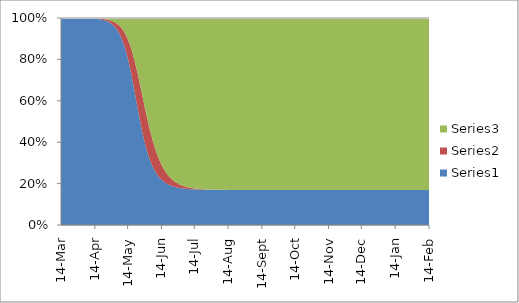
| Category | Series 0 | Series 1 | Series 2 |
|---|---|---|---|
| 2020-03-14 | 5600000 | 100 | 0 |
| 2020-03-15 | 5599970 | 115.714 | 14.286 |
| 2020-03-16 | 5599935.286 | 133.898 | 30.816 |
| 2020-03-17 | 5599895.117 | 154.938 | 49.945 |
| 2020-03-18 | 5599848.636 | 179.285 | 72.079 |
| 2020-03-19 | 5599794.852 | 207.457 | 97.691 |
| 2020-03-20 | 5599732.618 | 240.055 | 127.327 |
| 2020-03-21 | 5599660.605 | 277.774 | 161.621 |
| 2020-03-22 | 5599577.277 | 321.42 | 201.303 |
| 2020-03-23 | 5599480.859 | 371.921 | 247.22 |
| 2020-03-24 | 5599369.293 | 430.356 | 300.352 |
| 2020-03-25 | 5599240.2 | 497.968 | 361.831 |
| 2020-03-26 | 5599090.83 | 576.2 | 432.97 |
| 2020-03-27 | 5598917.998 | 666.718 | 515.284 |
| 2020-03-28 | 5598718.021 | 771.449 | 610.529 |
| 2020-03-29 | 5598486.64 | 892.624 | 720.736 |
| 2020-03-30 | 5598218.925 | 1032.821 | 848.254 |
| 2020-03-31 | 5597909.177 | 1195.023 | 995.8 |
| 2020-04-01 | 5597550.804 | 1382.679 | 1166.518 |
| 2020-04-02 | 5597136.182 | 1599.775 | 1364.043 |
| 2020-04-03 | 5596656.495 | 1850.923 | 1592.582 |
| 2020-04-04 | 5596101.549 | 2141.451 | 1857 |
| 2020-04-05 | 5595459.561 | 2477.517 | 2162.921 |
| 2020-04-06 | 5594716.909 | 2866.239 | 2516.853 |
| 2020-04-07 | 5593857.848 | 3315.837 | 2926.315 |
| 2020-04-08 | 5592864.188 | 3835.806 | 3400.006 |
| 2020-04-09 | 5591714.913 | 4437.109 | 3947.978 |
| 2020-04-10 | 5590385.749 | 5132.399 | 4581.851 |
| 2020-04-11 | 5588848.673 | 5936.276 | 5315.051 |
| 2020-04-12 | 5587071.337 | 6865.573 | 6163.09 |
| 2020-04-13 | 5585016.42 | 7939.694 | 7143.887 |
| 2020-04-14 | 5582640.885 | 9180.987 | 8278.129 |
| 2020-04-15 | 5579895.127 | 10615.175 | 9589.698 |
| 2020-04-16 | 5576722.007 | 12271.841 | 11106.152 |
| 2020-04-17 | 5573055.759 | 14184.97 | 12859.272 |
| 2020-04-18 | 5568820.743 | 16393.561 | 14885.696 |
| 2020-04-19 | 5563930.057 | 18942.31 | 17227.633 |
| 2020-04-20 | 5558283.967 | 21882.356 | 19933.678 |
| 2020-04-21 | 5551768.162 | 25272.109 | 23059.728 |
| 2020-04-22 | 5544251.829 | 29178.142 | 26670.03 |
| 2020-04-23 | 5535585.527 | 33676.137 | 30838.336 |
| 2020-04-24 | 5525598.894 | 38851.893 | 35649.212 |
| 2020-04-25 | 5514098.181 | 44802.336 | 41199.483 |
| 2020-04-26 | 5500863.656 | 51636.528 | 47599.817 |
| 2020-04-27 | 5485646.933 | 59476.604 | 54976.463 |
| 2020-04-28 | 5468168.309 | 68458.57 | 63473.121 |
| 2020-04-29 | 5448114.22 | 78732.863 | 73252.917 |
| 2020-04-30 | 5425134.99 | 90464.541 | 84500.469 |
| 2020-05-01 | 5398843.078 | 103832.947 | 97423.975 |
| 2020-05-02 | 5368812.126 | 119030.622 | 112257.253 |
| 2020-05-03 | 5334577.141 | 136261.232 | 129261.627 |
| 2020-05-04 | 5295636.281 | 155736.201 | 148727.517 |
| 2020-05-05 | 5251454.731 | 177669.723 | 170975.546 |
| 2020-05-06 | 5201471.275 | 202271.79 | 196356.935 |
| 2020-05-07 | 5145108.19 | 229738.904 | 225252.905 |
| 2020-05-08 | 5081785.073 | 260242.178 | 258072.749 |
| 2020-05-09 | 5010937.137 | 293912.66 | 295250.203 |
| 2020-05-10 | 4932038.323 | 330823.952 | 337237.726 |
| 2020-05-11 | 4844629.229 | 370972.48 | 384498.29 |
| 2020-05-12 | 4748349.366 | 414256.275 | 437494.359 |
| 2020-05-13 | 4642972.57 | 460453.603 | 496673.827 |
| 2020-05-14 | 4528443.635 | 509203.452 | 562452.913 |
| 2020-05-15 | 4404913.325 | 559990.412 | 635196.263 |
| 2020-05-16 | 4272768.187 | 612136.919 | 715194.893 |
| 2020-05-17 | 4132651.09 | 664805.885 | 802643.025 |
| 2020-05-18 | 3985468.37 | 717016.336 | 897615.294 |
| 2020-05-19 | 3832380.195 | 767673.605 | 1000046.199 |
| 2020-05-20 | 3674772.135 | 815614.008 | 1109713.857 |
| 2020-05-21 | 3514208.084 | 859661.772 | 1226230.144 |
| 2020-05-22 | 3352367.172 | 898693.859 | 1349038.969 |
| 2020-05-23 | 3190969.755 | 931706.44 | 1477423.806 |
| 2020-05-24 | 3031699.376 | 957875.898 | 1610524.726 |
| 2020-05-25 | 2876128.389 | 976607.472 | 1747364.14 |
| 2020-05-26 | 2725654.363 | 987566.144 | 1886879.493 |
| 2020-05-27 | 2581452.722 | 990686.907 | 2027960.37 |
| 2020-05-28 | 2444448.539 | 986164.389 | 2169487.071 |
| 2020-05-29 | 2315307.748 | 974424.553 | 2310367.698 |
| 2020-05-30 | 2194445.638 | 956083.156 | 2449571.206 |
| 2020-05-31 | 2082048.897 | 931896.589 | 2586154.514 |
| 2020-06-01 | 1978106.704 | 902710.698 | 2719282.598 |
| 2020-06-02 | 1882446.449 | 869412.281 | 2848241.269 |
| 2020-06-03 | 1794770.268 | 832886.709 | 2972443.024 |
| 2020-06-04 | 1714689.537 | 793983.624 | 3091426.839 |
| 2020-06-05 | 1641755.497 | 753491.432 | 3204853.071 |
| 2020-06-06 | 1575485.031 | 712120.265 | 3312494.704 |
| 2020-06-07 | 1515381.38 | 670492.449 | 3414226.171 |
| 2020-06-08 | 1460950.035 | 629139.158 | 3510010.806 |
| 2020-06-09 | 1411710.345 | 588501.826 | 3599887.829 |
| 2020-06-10 | 1367203.518 | 548936.964 | 3683959.518 |
| 2020-06-11 | 1326997.703 | 510723.213 | 3762379.085 |
| 2020-06-12 | 1290690.817 | 474069.639 | 3835339.544 |
| 2020-06-13 | 1257911.675 | 439124.548 | 3903063.778 |
| 2020-06-14 | 1228319.894 | 405984.25 | 3965795.856 |
| 2020-06-15 | 1201604.973 | 374701.421 | 4023793.606 |
| 2020-06-16 | 1177484.808 | 345292.812 | 4077322.38 |
| 2020-06-17 | 1155703.895 | 317746.18 | 4126649.925 |
| 2020-06-18 | 1136031.368 | 292026.396 | 4172042.236 |
| 2020-06-19 | 1118258.985 | 268080.722 | 4213760.293 |
| 2020-06-20 | 1102199.145 | 245843.316 | 4252057.539 |
| 2020-06-21 | 1087682.987 | 225239.001 | 4287178.013 |
| 2020-06-22 | 1074558.596 | 206186.391 | 4319355.013 |
| 2020-06-23 | 1062689.345 | 188600.444 | 4348810.211 |
| 2020-06-24 | 1051952.362 | 172394.506 | 4375753.132 |
| 2020-06-25 | 1042237.14 | 157481.942 | 4400380.919 |
| 2020-06-26 | 1033444.272 | 143777.389 | 4422878.339 |
| 2020-06-27 | 1025484.312 | 131197.722 | 4443417.966 |
| 2020-06-28 | 1018276.748 | 119662.755 | 4462160.497 |
| 2020-06-29 | 1011749.08 | 109095.743 | 4479255.177 |
| 2020-06-30 | 1005835.998 | 99423.719 | 4494840.283 |
| 2020-07-01 | 1000478.644 | 90577.685 | 4509043.671 |
| 2020-07-02 | 995623.945 | 82492.714 | 4521983.341 |
| 2020-07-03 | 991224.032 | 75107.954 | 4533768.014 |
| 2020-07-04 | 987235.702 | 68366.576 | 4544497.722 |
| 2020-07-05 | 983619.957 | 62215.668 | 4554264.375 |
| 2020-07-06 | 980341.569 | 56606.103 | 4563152.328 |
| 2020-07-07 | 977368.712 | 51492.373 | 4571238.914 |
| 2020-07-08 | 974672.621 | 46832.411 | 4578594.968 |
| 2020-07-09 | 972227.286 | 42587.402 | 4585285.312 |
| 2020-07-10 | 970009.18 | 38721.593 | 4591369.227 |
| 2020-07-11 | 967997.021 | 35202.096 | 4596900.883 |
| 2020-07-12 | 966171.547 | 31998.7 | 4601929.754 |
| 2020-07-13 | 964515.32 | 29083.684 | 4606500.997 |
| 2020-07-14 | 963012.552 | 26431.639 | 4610655.808 |
| 2020-07-15 | 961648.945 | 24019.298 | 4614431.757 |
| 2020-07-16 | 960411.545 | 21825.37 | 4617863.085 |
| 2020-07-17 | 959288.617 | 19830.388 | 4620980.995 |
| 2020-07-18 | 958269.524 | 18016.569 | 4623813.908 |
| 2020-07-19 | 957344.628 | 16367.669 | 4626387.703 |
| 2020-07-20 | 956505.19 | 14868.868 | 4628725.942 |
| 2020-07-21 | 955743.289 | 13506.645 | 4630850.066 |
| 2020-07-22 | 955051.742 | 12268.672 | 4632779.586 |
| 2020-07-23 | 954424.034 | 11143.712 | 4634532.254 |
| 2020-07-24 | 953854.257 | 10121.53 | 4636124.213 |
| 2020-07-25 | 953337.054 | 9192.801 | 4637570.146 |
| 2020-07-26 | 952867.563 | 8349.035 | 4638883.403 |
| 2020-07-27 | 952441.374 | 7582.504 | 4640076.122 |
| 2020-07-28 | 952054.487 | 6886.176 | 4641159.337 |
| 2020-07-29 | 951703.272 | 6253.652 | 4642143.076 |
| 2020-07-30 | 951384.435 | 5679.11 | 4643036.455 |
| 2020-07-31 | 951094.987 | 5157.256 | 4643847.757 |
| 2020-08-01 | 950832.217 | 4683.275 | 4644584.508 |
| 2020-08-02 | 950593.663 | 4252.79 | 4645253.547 |
| 2020-08-03 | 950377.092 | 3861.82 | 4645861.088 |
| 2020-08-04 | 950180.474 | 3506.749 | 4646412.777 |
| 2020-08-05 | 950001.972 | 3184.287 | 4646913.741 |
| 2020-08-06 | 949839.914 | 2891.447 | 4647368.639 |
| 2020-08-07 | 949692.785 | 2625.512 | 4647781.703 |
| 2020-08-08 | 949559.209 | 2384.015 | 4648156.776 |
| 2020-08-09 | 949437.935 | 2164.715 | 4648497.35 |
| 2020-08-10 | 949327.832 | 1965.573 | 4648806.595 |
| 2020-08-11 | 949227.869 | 1784.74 | 4649087.391 |
| 2020-08-12 | 949137.113 | 1620.534 | 4649342.354 |
| 2020-08-13 | 949054.714 | 1471.428 | 4649573.858 |
| 2020-08-14 | 948979.903 | 1336.034 | 4649784.062 |
| 2020-08-15 | 948911.982 | 1213.094 | 4649974.924 |
| 2020-08-16 | 948850.315 | 1101.462 | 4650148.224 |
| 2020-08-17 | 948794.326 | 1000.099 | 4650305.575 |
| 2020-08-18 | 948743.493 | 908.061 | 4650448.447 |
| 2020-08-19 | 948697.34 | 824.491 | 4650578.17 |
| 2020-08-20 | 948655.437 | 748.609 | 4650695.954 |
| 2020-08-21 | 948617.392 | 679.71 | 4650802.898 |
| 2020-08-22 | 948582.85 | 617.151 | 4650900 |
| 2020-08-23 | 948551.488 | 560.348 | 4650988.164 |
| 2020-08-24 | 948523.014 | 508.773 | 4651068.214 |
| 2020-08-25 | 948497.161 | 461.943 | 4651140.895 |
| 2020-08-26 | 948473.689 | 419.424 | 4651206.887 |
| 2020-08-27 | 948452.377 | 380.818 | 4651266.805 |
| 2020-08-28 | 948433.028 | 345.764 | 4651321.208 |
| 2020-08-29 | 948415.46 | 313.937 | 4651370.602 |
| 2020-08-30 | 948399.51 | 285.04 | 4651415.451 |
| 2020-08-31 | 948385.028 | 258.802 | 4651456.171 |
| 2020-09-01 | 948371.879 | 234.979 | 4651493.142 |
| 2020-09-02 | 948359.941 | 213.349 | 4651526.711 |
| 2020-09-03 | 948349.101 | 193.71 | 4651557.189 |
| 2020-09-04 | 948339.26 | 175.878 | 4651584.862 |
| 2020-09-05 | 948330.325 | 159.688 | 4651609.987 |
| 2020-09-06 | 948322.212 | 144.988 | 4651632.8 |
| 2020-09-07 | 948314.846 | 131.641 | 4651653.513 |
| 2020-09-08 | 948308.159 | 119.523 | 4651672.318 |
| 2020-09-09 | 948302.086 | 108.52 | 4651689.393 |
| 2020-09-10 | 948296.573 | 98.531 | 4651704.896 |
| 2020-09-11 | 948291.568 | 89.46 | 4651718.972 |
| 2020-09-12 | 948287.023 | 81.225 | 4651731.752 |
| 2020-09-13 | 948282.897 | 73.748 | 4651743.355 |
| 2020-09-14 | 948279.15 | 66.959 | 4651753.891 |
| 2020-09-15 | 948275.749 | 60.795 | 4651763.456 |
| 2020-09-16 | 948272.661 | 55.198 | 4651772.141 |
| 2020-09-17 | 948269.856 | 50.117 | 4651780.027 |
| 2020-09-18 | 948267.31 | 45.503 | 4651787.186 |
| 2020-09-19 | 948264.999 | 41.314 | 4651793.687 |
| 2020-09-20 | 948262.9 | 37.511 | 4651799.589 |
| 2020-09-21 | 948260.995 | 34.058 | 4651804.948 |
| 2020-09-22 | 948259.264 | 30.923 | 4651809.813 |
| 2020-09-23 | 948257.694 | 28.076 | 4651814.23 |
| 2020-09-24 | 948256.267 | 25.491 | 4651818.241 |
| 2020-09-25 | 948254.972 | 23.145 | 4651821.883 |
| 2020-09-26 | 948253.797 | 21.014 | 4651825.189 |
| 2020-09-27 | 948252.729 | 19.08 | 4651828.191 |
| 2020-09-28 | 948251.76 | 17.323 | 4651830.917 |
| 2020-09-29 | 948250.88 | 15.728 | 4651833.392 |
| 2020-09-30 | 948250.081 | 14.28 | 4651835.639 |
| 2020-10-01 | 948249.356 | 12.966 | 4651837.679 |
| 2020-10-02 | 948248.697 | 11.772 | 4651839.531 |
| 2020-10-03 | 948248.099 | 10.688 | 4651841.213 |
| 2020-10-04 | 948247.556 | 9.705 | 4651842.74 |
| 2020-10-05 | 948247.063 | 8.811 | 4651844.126 |
| 2020-10-06 | 948246.615 | 8 | 4651845.385 |
| 2020-10-07 | 948246.209 | 7.264 | 4651846.528 |
| 2020-10-08 | 948245.84 | 6.595 | 4651847.565 |
| 2020-10-09 | 948245.505 | 5.988 | 4651848.507 |
| 2020-10-10 | 948245.201 | 5.437 | 4651849.363 |
| 2020-10-11 | 948244.925 | 4.936 | 4651850.139 |
| 2020-10-12 | 948244.674 | 4.482 | 4651850.844 |
| 2020-10-13 | 948244.446 | 4.069 | 4651851.485 |
| 2020-10-14 | 948244.24 | 3.694 | 4651852.066 |
| 2020-10-15 | 948244.052 | 3.354 | 4651852.594 |
| 2020-10-16 | 948243.881 | 3.046 | 4651853.073 |
| 2020-10-17 | 948243.727 | 2.765 | 4651853.508 |
| 2020-10-18 | 948243.586 | 2.511 | 4651853.903 |
| 2020-10-19 | 948243.459 | 2.28 | 4651854.262 |
| 2020-10-20 | 948243.343 | 2.07 | 4651854.587 |
| 2020-10-21 | 948243.238 | 1.879 | 4651854.883 |
| 2020-10-22 | 948243.142 | 1.706 | 4651855.152 |
| 2020-10-23 | 948243.056 | 1.549 | 4651855.395 |
| 2020-10-24 | 948242.977 | 1.406 | 4651855.617 |
| 2020-10-25 | 948242.906 | 1.277 | 4651855.817 |
| 2020-10-26 | 948242.841 | 1.159 | 4651856 |
| 2020-10-27 | 948242.782 | 1.053 | 4651856.166 |
| 2020-10-28 | 948242.728 | 0.956 | 4651856.316 |
| 2020-10-29 | 948242.68 | 0.868 | 4651856.452 |
| 2020-10-30 | 948242.636 | 0.788 | 4651856.576 |
| 2020-10-31 | 948242.596 | 0.715 | 4651856.689 |
| 2020-11-01 | 948242.559 | 0.65 | 4651856.791 |
| 2020-11-02 | 948242.526 | 0.59 | 4651856.884 |
| 2020-11-03 | 948242.496 | 0.535 | 4651856.968 |
| 2020-11-04 | 948242.469 | 0.486 | 4651857.045 |
| 2020-11-05 | 948242.444 | 0.441 | 4651857.114 |
| 2020-11-06 | 948242.422 | 0.401 | 4651857.177 |
| 2020-11-07 | 948242.402 | 0.364 | 4651857.234 |
| 2020-11-08 | 948242.383 | 0.33 | 4651857.286 |
| 2020-11-09 | 948242.366 | 0.3 | 4651857.334 |
| 2020-11-10 | 948242.351 | 0.272 | 4651857.377 |
| 2020-11-11 | 948242.337 | 0.247 | 4651857.415 |
| 2020-11-12 | 948242.325 | 0.225 | 4651857.451 |
| 2020-11-13 | 948242.313 | 0.204 | 4651857.483 |
| 2020-11-14 | 948242.303 | 0.185 | 4651857.512 |
| 2020-11-15 | 948242.294 | 0.168 | 4651857.538 |
| 2020-11-16 | 948242.285 | 0.153 | 4651857.562 |
| 2020-11-17 | 948242.277 | 0.139 | 4651857.584 |
| 2020-11-18 | 948242.27 | 0.126 | 4651857.604 |
| 2020-11-19 | 948242.264 | 0.114 | 4651857.622 |
| 2020-11-20 | 948242.258 | 0.104 | 4651857.638 |
| 2020-11-21 | 948242.253 | 0.094 | 4651857.653 |
| 2020-11-22 | 948242.248 | 0.085 | 4651857.667 |
| 2020-11-23 | 948242.244 | 0.078 | 4651857.679 |
| 2020-11-24 | 948242.24 | 0.07 | 4651857.69 |
| 2020-11-25 | 948242.236 | 0.064 | 4651857.7 |
| 2020-11-26 | 948242.233 | 0.058 | 4651857.709 |
| 2020-11-27 | 948242.23 | 0.053 | 4651857.717 |
| 2020-11-28 | 948242.227 | 0.048 | 4651857.725 |
| 2020-11-29 | 948242.225 | 0.043 | 4651857.732 |
| 2020-11-30 | 948242.223 | 0.039 | 4651857.738 |
| 2020-12-01 | 948242.221 | 0.036 | 4651857.744 |
| 2020-12-02 | 948242.219 | 0.033 | 4651857.749 |
| 2020-12-03 | 948242.217 | 0.03 | 4651857.753 |
| 2020-12-04 | 948242.216 | 0.027 | 4651857.758 |
| 2020-12-05 | 948242.214 | 0.024 | 4651857.761 |
| 2020-12-06 | 948242.213 | 0.022 | 4651857.765 |
| 2020-12-07 | 948242.212 | 0.02 | 4651857.768 |
| 2020-12-08 | 948242.211 | 0.018 | 4651857.771 |
| 2020-12-09 | 948242.21 | 0.017 | 4651857.773 |
| 2020-12-10 | 948242.209 | 0.015 | 4651857.776 |
| 2020-12-11 | 948242.208 | 0.014 | 4651857.778 |
| 2020-12-12 | 948242.208 | 0.012 | 4651857.78 |
| 2020-12-13 | 948242.207 | 0.011 | 4651857.782 |
| 2020-12-14 | 948242.206 | 0.01 | 4651857.783 |
| 2020-12-15 | 948242.206 | 0.009 | 4651857.785 |
| 2020-12-16 | 948242.205 | 0.008 | 4651857.786 |
| 2020-12-17 | 948242.205 | 0.008 | 4651857.787 |
| 2020-12-18 | 948242.205 | 0.007 | 4651857.788 |
| 2020-12-19 | 948242.204 | 0.006 | 4651857.789 |
| 2020-12-20 | 948242.204 | 0.006 | 4651857.79 |
| 2020-12-21 | 948242.204 | 0.005 | 4651857.791 |
| 2020-12-22 | 948242.203 | 0.005 | 4651857.792 |
| 2020-12-23 | 948242.203 | 0.004 | 4651857.793 |
| 2020-12-24 | 948242.203 | 0.004 | 4651857.793 |
| 2020-12-25 | 948242.203 | 0.004 | 4651857.794 |
| 2020-12-26 | 948242.203 | 0.003 | 4651857.794 |
| 2020-12-27 | 948242.202 | 0.003 | 4651857.795 |
| 2020-12-28 | 948242.202 | 0.003 | 4651857.795 |
| 2020-12-29 | 948242.202 | 0.002 | 4651857.795 |
| 2020-12-30 | 948242.202 | 0.002 | 4651857.796 |
| 2020-12-31 | 948242.202 | 0.002 | 4651857.796 |
| 2021-01-01 | 948242.202 | 0.002 | 4651857.796 |
| 2021-01-02 | 948242.202 | 0.002 | 4651857.797 |
| 2021-01-03 | 948242.202 | 0.001 | 4651857.797 |
| 2021-01-04 | 948242.202 | 0.001 | 4651857.797 |
| 2021-01-05 | 948242.202 | 0.001 | 4651857.797 |
| 2021-01-06 | 948242.201 | 0.001 | 4651857.797 |
| 2021-01-07 | 948242.201 | 0.001 | 4651857.798 |
| 2021-01-08 | 948242.201 | 0.001 | 4651857.798 |
| 2021-01-09 | 948242.201 | 0.001 | 4651857.798 |
| 2021-01-10 | 948242.201 | 0.001 | 4651857.798 |
| 2021-01-11 | 948242.201 | 0.001 | 4651857.798 |
| 2021-01-12 | 948242.201 | 0.001 | 4651857.798 |
| 2021-01-13 | 948242.201 | 0.001 | 4651857.798 |
| 2021-01-14 | 948242.201 | 0.001 | 4651857.798 |
| 2021-01-15 | 948242.201 | 0 | 4651857.798 |
| 2021-01-16 | 948242.201 | 0 | 4651857.798 |
| 2021-01-17 | 948242.201 | 0 | 4651857.799 |
| 2021-01-18 | 948242.201 | 0 | 4651857.799 |
| 2021-01-19 | 948242.201 | 0 | 4651857.799 |
| 2021-01-20 | 948242.201 | 0 | 4651857.799 |
| 2021-01-21 | 948242.201 | 0 | 4651857.799 |
| 2021-01-22 | 948242.201 | 0 | 4651857.799 |
| 2021-01-23 | 948242.201 | 0 | 4651857.799 |
| 2021-01-24 | 948242.201 | 0 | 4651857.799 |
| 2021-01-25 | 948242.201 | 0 | 4651857.799 |
| 2021-01-26 | 948242.201 | 0 | 4651857.799 |
| 2021-01-27 | 948242.201 | 0 | 4651857.799 |
| 2021-01-28 | 948242.201 | 0 | 4651857.799 |
| 2021-01-29 | 948242.201 | 0 | 4651857.799 |
| 2021-01-30 | 948242.201 | 0 | 4651857.799 |
| 2021-01-31 | 948242.201 | 0 | 4651857.799 |
| 2021-02-01 | 948242.201 | 0 | 4651857.799 |
| 2021-02-02 | 948242.201 | 0 | 4651857.799 |
| 2021-02-03 | 948242.201 | 0 | 4651857.799 |
| 2021-02-04 | 948242.201 | 0 | 4651857.799 |
| 2021-02-05 | 948242.201 | 0 | 4651857.799 |
| 2021-02-06 | 948242.201 | 0 | 4651857.799 |
| 2021-02-07 | 948242.201 | 0 | 4651857.799 |
| 2021-02-08 | 948242.201 | 0 | 4651857.799 |
| 2021-02-09 | 948242.201 | 0 | 4651857.799 |
| 2021-02-10 | 948242.201 | 0 | 4651857.799 |
| 2021-02-11 | 948242.201 | 0 | 4651857.799 |
| 2021-02-12 | 948242.201 | 0 | 4651857.799 |
| 2021-02-13 | 948242.201 | 0 | 4651857.799 |
| 2021-02-14 | 948242.201 | 0 | 4651857.799 |